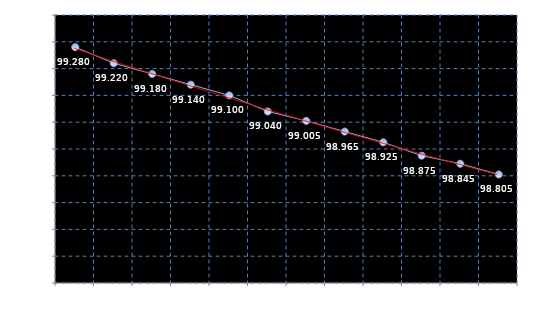
| Category | Series 0 |
|---|---|
| Sep 16 | 99.28 |
| Dec 16 | 99.22 |
| Mar 17 | 99.18 |
| Jun 17 | 99.14 |
| Sep 17 | 99.1 |
| Dec 17 | 99.04 |
| Mar 18 | 99.005 |
| Jun 18 | 98.965 |
| Sep 18 | 98.925 |
| Dec 18 | 98.875 |
| Mar 19 | 98.845 |
| Jun 19 | 98.805 |